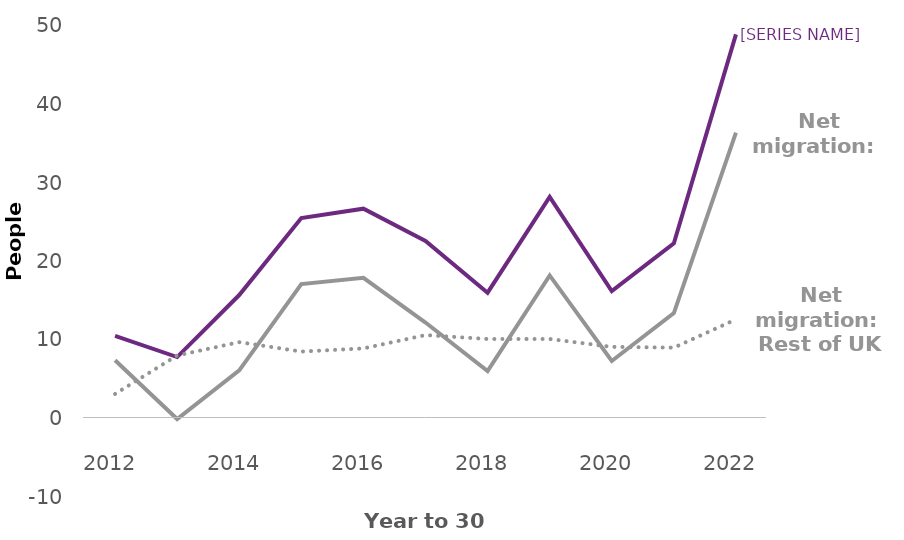
| Category | Total net migration | Net migration:  International | Net migration: 
Rest of UK
 |
|---|---|---|---|
| 2012 | 10400 | 7300 | 3000 |
| 2013 | 7700 | -200 | 7900 |
| 2014 | 15600 | 6000 | 9600 |
| 2015 | 25400 | 17000 | 8400 |
| 2016 | 26600 | 17800 | 8800 |
| 2017 | 22500 | 12100 | 10500 |
| 2018 | 15900 | 5900 | 10000 |
| 2019 | 28100 | 18100 | 10000 |
| 2020 | 16100 | 7200 | 9000 |
| 2021 | 22200 | 13300 | 8900 |
| 2022 | 48800 | 36300 | 12500 |